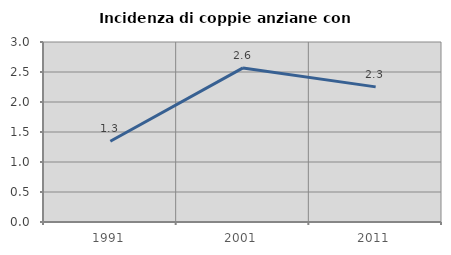
| Category | Incidenza di coppie anziane con figli |
|---|---|
| 1991.0 | 1.347 |
| 2001.0 | 2.568 |
| 2011.0 | 2.252 |